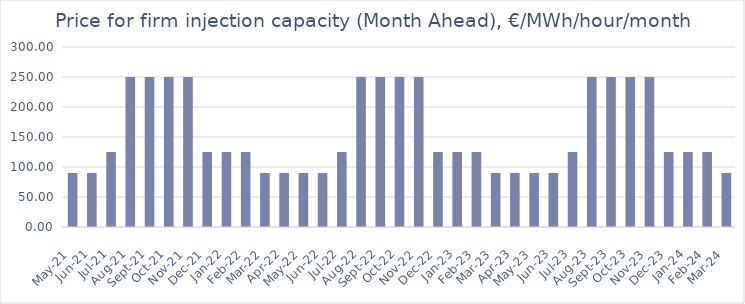
| Category | MA price, €/MWh/hour/month |
|---|---|
| 2021-05-01 | 90 |
| 2021-06-01 | 90 |
| 2021-07-01 | 125 |
| 2021-08-01 | 250 |
| 2021-09-01 | 250 |
| 2021-10-01 | 250 |
| 2021-11-01 | 250 |
| 2021-12-01 | 125 |
| 2022-01-01 | 125 |
| 2022-02-01 | 125 |
| 2022-03-01 | 90 |
| 2022-04-01 | 90 |
| 2022-05-01 | 90 |
| 2022-06-01 | 90 |
| 2022-07-01 | 125 |
| 2022-08-01 | 250 |
| 2022-09-01 | 250 |
| 2022-10-01 | 250 |
| 2022-11-01 | 250 |
| 2022-12-01 | 125 |
| 2023-01-01 | 125 |
| 2023-02-01 | 125 |
| 2023-03-01 | 90 |
| 2023-04-01 | 90 |
| 2023-05-01 | 90 |
| 2023-06-01 | 90 |
| 2023-07-01 | 125 |
| 2023-08-01 | 250 |
| 2023-09-01 | 250 |
| 2023-10-01 | 250 |
| 2023-11-01 | 250 |
| 2023-12-01 | 125 |
| 2024-01-01 | 125 |
| 2024-02-01 | 125 |
| 2024-03-01 | 90 |